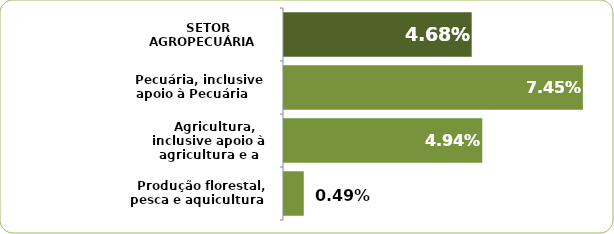
| Category | Series 0 |
|---|---|
|    Produção florestal, pesca e aquicultura | 0.005 |
|    Agricultura, inclusive apoio à agricultura e a pós-colheita | 0.049 |
|    Pecuária, inclusive apoio à Pecuária | 0.074 |
|    SETOR AGROPECUÁRIA | 0.047 |